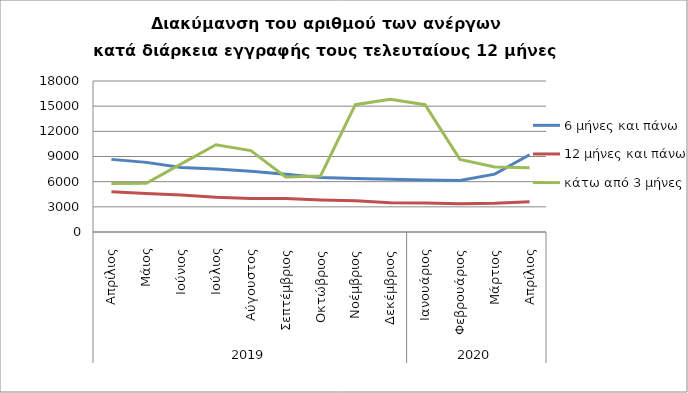
| Category | 6 μήνες και πάνω | 12 μήνες και πάνω | κάτω από 3 μήνες |
|---|---|---|---|
| 0 | 8657 | 4796 | 5790 |
| 1 | 8300 | 4594 | 5815 |
| 2 | 7689 | 4420 | 8126 |
| 3 | 7497 | 4136 | 10405 |
| 4 | 7250 | 3992 | 9701 |
| 5 | 6882 | 3982 | 6563 |
| 6 | 6500 | 3821 | 6686 |
| 7 | 6379 | 3715 | 15176 |
| 8 | 6275 | 3478 | 15812 |
| 9 | 6184 | 3454 | 15175 |
| 10 | 6133 | 3369 | 8651 |
| 11 | 6894 | 3423 | 7759 |
| 12 | 9204 | 3615 | 7657 |